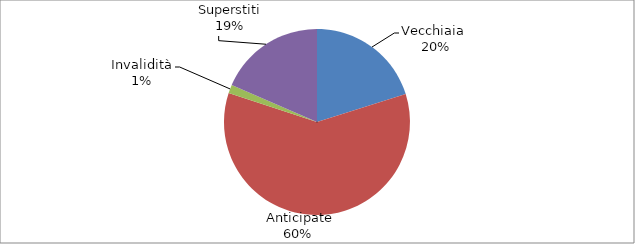
| Category | Series 0 |
|---|---|
| Vecchiaia  | 24695 |
|  Anticipate | 73425 |
| Invalidità | 1790 |
| Superstiti | 22656 |